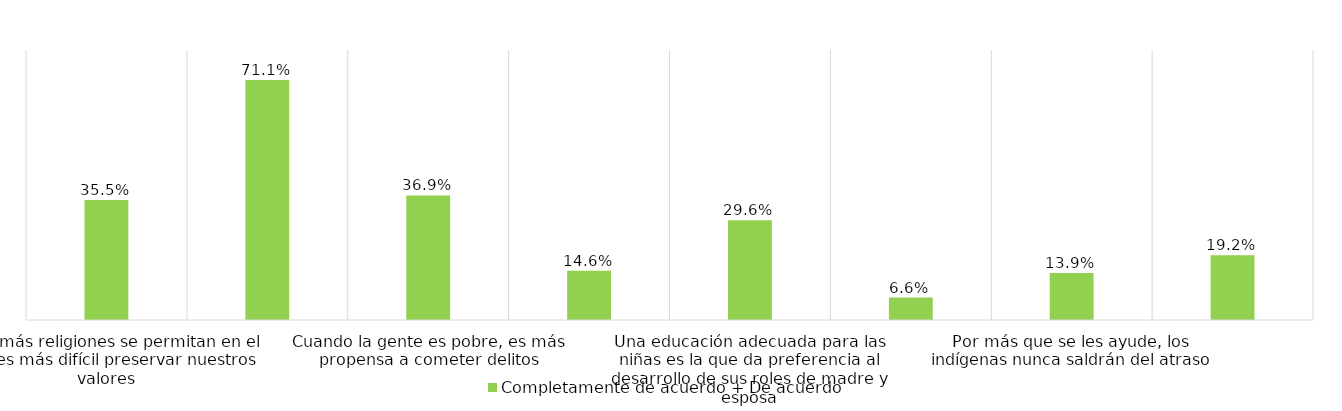
| Category | Completamente de acuerdo + De acuerdo  |
|---|---|
| Entre más religiones se permitan en el país, es más difícil preservar nuestros valores | 0.355 |
| A los homosexuales se les debe permitir ser profesores de colegio | 0.711 |
| Cuando la gente es pobre, es más propensa a cometer delitos | 0.369 |
| Por sus características, los negros siempre tendrán limitaciones | 0.146 |
| Una educación adecuada para las niñas es la que da preferencia al desarrollo de sus roles de madre y esposa | 0.296 |
| Las personas enfermas de SIDA deben ser alejadas del resto de las personas | 0.066 |
| Por más que se les ayude, los indígenas nunca saldrán del atraso | 0.139 |
| Las personas discapacitadas pueden ser buenas trabajadoras, pero no en niveles directivos | 0.192 |